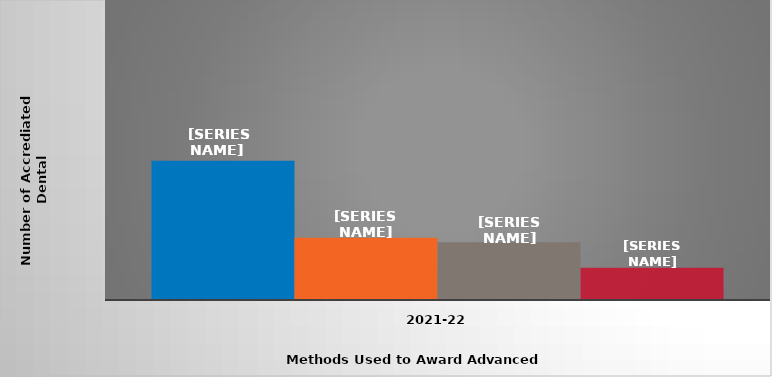
| Category | Transfer of credit | Equivalency examinations | Challenge examinations | Other |
|---|---|---|---|---|
| 2021-22 | 65 | 29 | 27 | 15 |